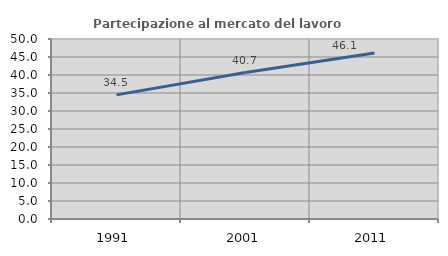
| Category | Partecipazione al mercato del lavoro  femminile |
|---|---|
| 1991.0 | 34.476 |
| 2001.0 | 40.679 |
| 2011.0 | 46.117 |